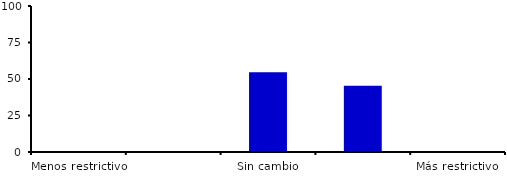
| Category | Series 0 |
|---|---|
| Menos restrictivo | 0 |
| Moderadamente menos restrictivo | 0 |
| Sin cambio | 54.545 |
| Moderadamente más restrictivo | 45.455 |
| Más restrictivo | 0 |